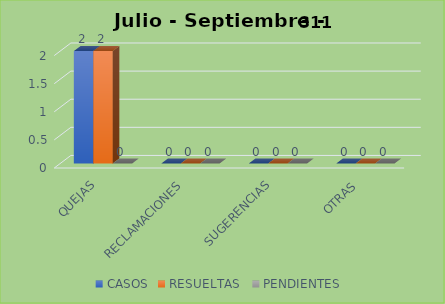
| Category | CASOS | RESUELTAS  | PENDIENTES  |
|---|---|---|---|
| QUEJAS | 2 | 2 | 0 |
| RECLAMACIONES | 0 | 0 | 0 |
| SUGERENCIAS | 0 | 0 | 0 |
| OTRAS | 0 | 0 | 0 |